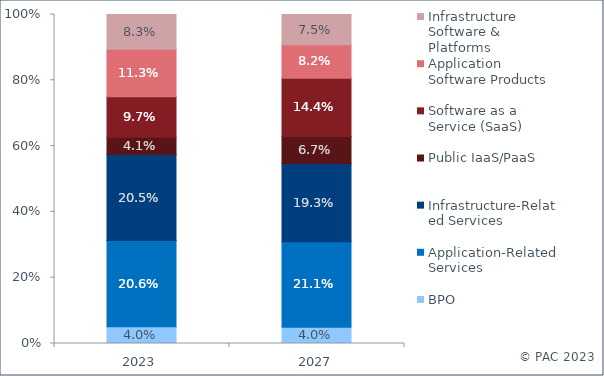
| Category | BPO | Application-Related Services | Infrastructure-Related Services | Public IaaS/PaaS | Software as a Service (SaaS) | Application Software Products | Infrastructure Software & Platforms |
|---|---|---|---|---|---|---|---|
| 2023.0 | 0.04 | 0.206 | 0.205 | 0.041 | 0.097 | 0.113 | 0.083 |
| 2027.0 | 0.04 | 0.211 | 0.193 | 0.067 | 0.144 | 0.082 | 0.075 |